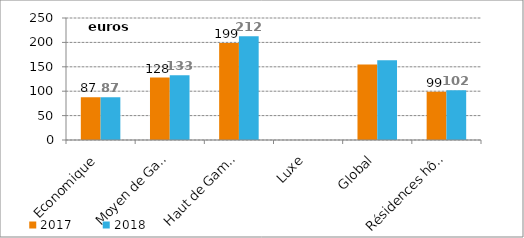
| Category | 2017 | 2018 |
|---|---|---|
| Economique | 87.494 | 87.418 |
| Moyen de Gamme | 127.948 | 132.802 |
| Haut de Gamme | 198.945 | 212.349 |
| Luxe | 0 | 0 |
| Global | 154.703 | 163.558 |
| Résidences hôtelières | 98.87 | 101.82 |